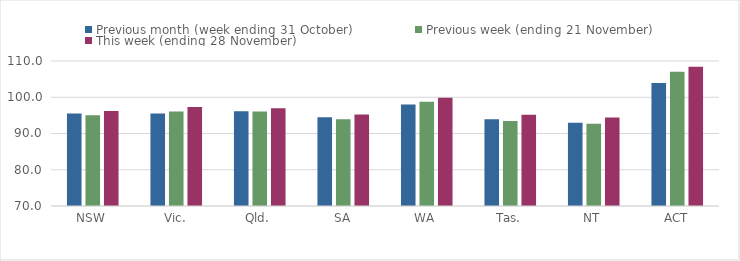
| Category | Previous month (week ending 31 October) | Previous week (ending 21 November) | This week (ending 28 November) |
|---|---|---|---|
| NSW | 95.54 | 95.02 | 96.19 |
| Vic. | 95.49 | 96.05 | 97.33 |
| Qld. | 96.15 | 96.07 | 96.99 |
| SA | 94.45 | 93.92 | 95.21 |
| WA | 98.02 | 98.73 | 99.86 |
| Tas. | 93.91 | 93.44 | 95.15 |
| NT | 92.94 | 92.68 | 94.38 |
| ACT | 103.93 | 107.01 | 108.39 |